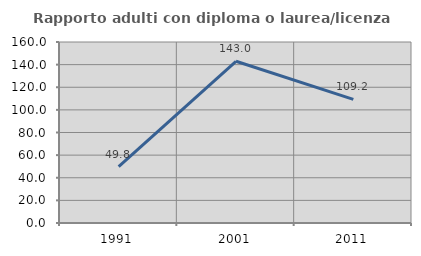
| Category | Rapporto adulti con diploma o laurea/licenza media  |
|---|---|
| 1991.0 | 49.845 |
| 2001.0 | 142.951 |
| 2011.0 | 109.247 |